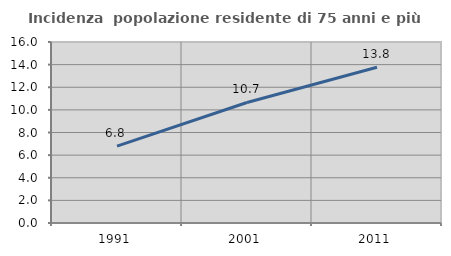
| Category | Incidenza  popolazione residente di 75 anni e più |
|---|---|
| 1991.0 | 6.797 |
| 2001.0 | 10.655 |
| 2011.0 | 13.766 |